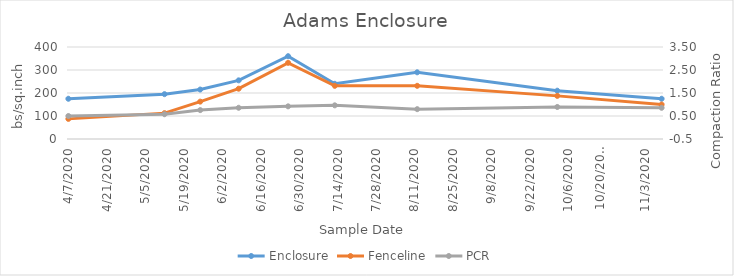
| Category | Enclosure | Fenceline |
|---|---|---|
| 4/7/20 | 175 | 87.5 |
| 5/12/20 | 195 | 112.5 |
| 5/25/20 | 215 | 162.5 |
| 6/8/20 | 255 | 218.75 |
| 6/26/20 | 360 | 331.25 |
| 7/13/20 | 240 | 231.25 |
| 8/12/20 | 290 | 231.25 |
| 10/2/20 | 210 | 187.5 |
| 11/9/20 | 175 | 150 |